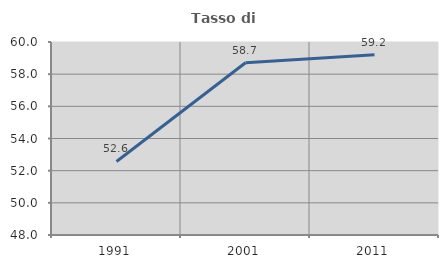
| Category | Tasso di occupazione   |
|---|---|
| 1991.0 | 52.571 |
| 2001.0 | 58.708 |
| 2011.0 | 59.205 |